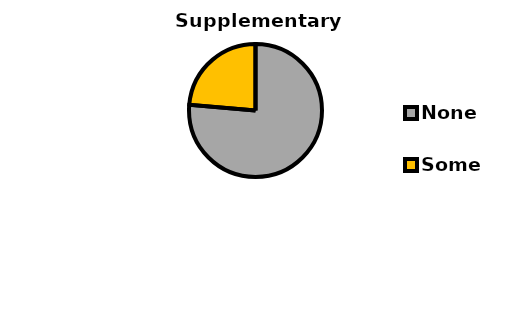
| Category | Series 0 |
|---|---|
| None | 727 |
| Some  | 225 |